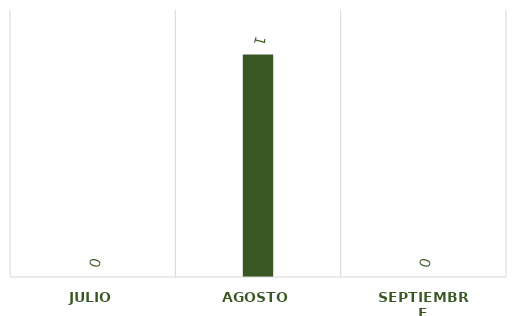
| Category | CANTIDAD |
|---|---|
| JULIO | 0 |
| AGOSTO | 1 |
| SEPTIEMBRE | 0 |